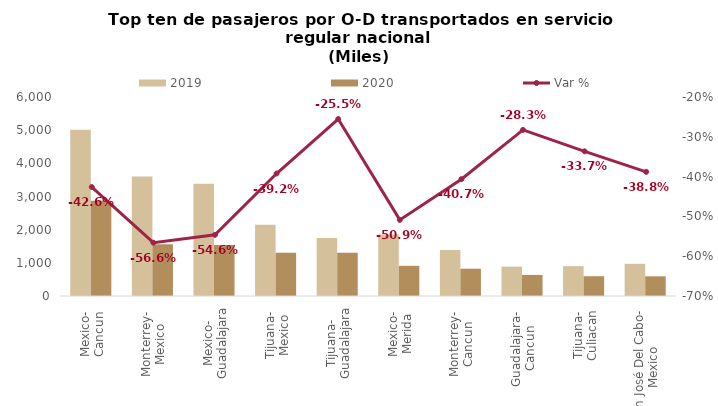
| Category | 2019 | 2020 |
|---|---|---|
| Mexico-
Cancun | 5009.235 | 2874.267 |
| Monterrey-
Mexico | 3601.937 | 1563.243 |
| Mexico-
Guadalajara | 3386.521 | 1536.441 |
| Tijuana-
Mexico | 2151.343 | 1307.478 |
| Tijuana-
Guadalajara | 1748.213 | 1301.775 |
| Mexico-
Merida | 1851.414 | 909.396 |
| Monterrey-
Cancun | 1386.056 | 822.601 |
| Guadalajara-
Cancun | 885.881 | 635.422 |
| Tijuana-
Culiacan | 899.412 | 596.754 |
| San José Del Cabo-
Mexico | 971.016 | 594.263 |